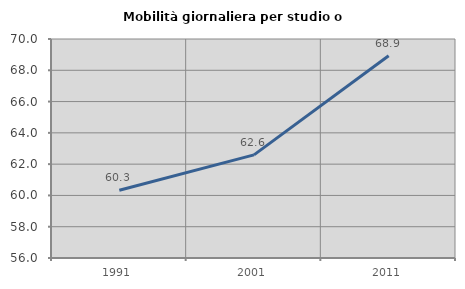
| Category | Mobilità giornaliera per studio o lavoro |
|---|---|
| 1991.0 | 60.328 |
| 2001.0 | 62.59 |
| 2011.0 | 68.931 |